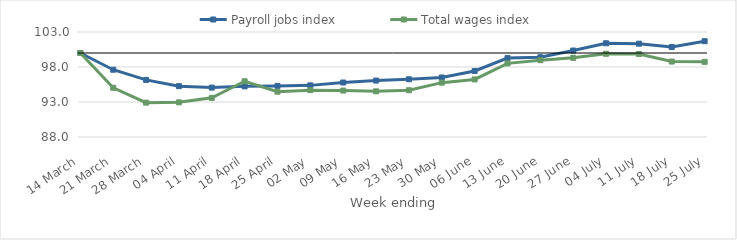
| Category | Payroll jobs index | Total wages index |
|---|---|---|
| 2020-03-14 | 100 | 100 |
| 2020-03-21 | 97.611 | 95.033 |
| 2020-03-28 | 96.156 | 92.906 |
| 2020-04-04 | 95.262 | 92.949 |
| 2020-04-11 | 95.059 | 93.592 |
| 2020-04-18 | 95.233 | 95.961 |
| 2020-04-25 | 95.3 | 94.475 |
| 2020-05-02 | 95.375 | 94.695 |
| 2020-05-09 | 95.783 | 94.63 |
| 2020-05-16 | 96.063 | 94.524 |
| 2020-05-23 | 96.244 | 94.682 |
| 2020-05-30 | 96.503 | 95.763 |
| 2020-06-06 | 97.436 | 96.226 |
| 2020-06-13 | 99.274 | 98.519 |
| 2020-06-20 | 99.392 | 98.974 |
| 2020-06-27 | 100.355 | 99.319 |
| 2020-07-04 | 101.39 | 99.891 |
| 2020-07-11 | 101.331 | 99.856 |
| 2020-07-18 | 100.851 | 98.778 |
| 2020-07-25 | 101.685 | 98.74 |